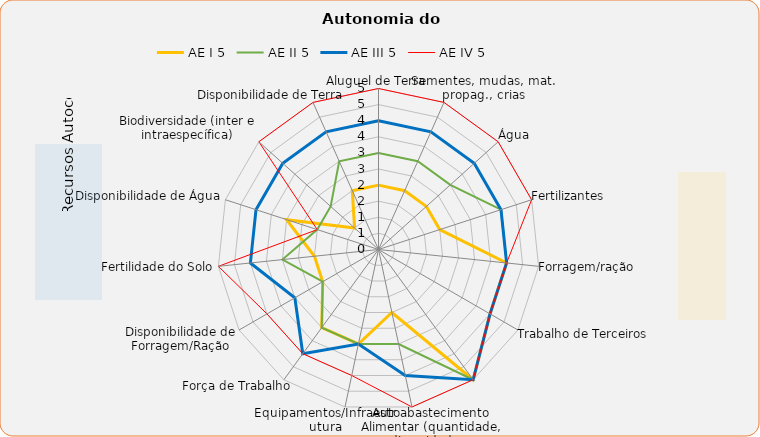
| Category | AE I | AE II | AE III | AE IV |
|---|---|---|---|---|
| Aluguel de Terra | 2 | 3 | 4 | 5 |
| Sementes, mudas, mat. propag., crias | 2 | 3 | 4 | 5 |
| Água | 2 | 3 | 4 | 5 |
| Fertilizantes | 2 | 4 | 4 | 5 |
| Forragem/ração | 4 | 4 | 4 | 4 |
| Trabalho de Terceiros | 4 | 4 | 4 | 4 |
|  | 5 | 5 | 5 | 5 |
| Autoabastecimento Alimentar (quantidade, diversidade e qualidade) | 2 | 3 | 4 | 5 |
| Equipamentos/Infraestrutura | 3 | 3 | 3 | 4 |
| Força de Trabalho | 3 | 3 | 4 | 4 |
| Disponibilidade de Forragem/Ração | 2 | 2 | 3 | 4 |
| Fertilidade do Solo | 2 | 3 | 4 | 5 |
| Disponibilidade de Água | 3 | 2 | 4 | 2 |
| Biodiversidade (inter e intraespecífica) | 1 | 2 | 4 | 5 |
| Disponibilidade de Terra | 2 | 3 | 4 | 5 |